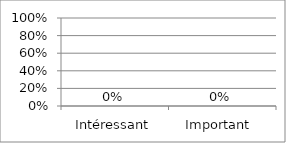
| Category | Series 0 |
|---|---|
| Intéressant | 0 |
| Important  | 0 |